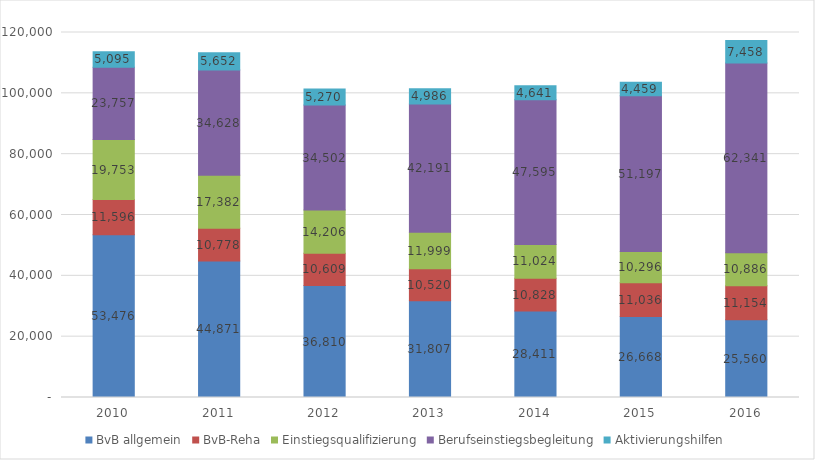
| Category | BvB allgemein | BvB-Reha | Einstiegsqualifizierung | Berufseinstiegsbegleitung | Aktivierungshilfen |
|---|---|---|---|---|---|
| 2010.0 | 53476.083 | 11596.25 | 19753.167 | 23756.833 | 5095 |
| 2011.0 | 44871 | 10777.667 | 17382 | 34627.833 | 5652 |
| 2012.0 | 36810.417 | 10608.667 | 14205.583 | 34501.5 | 5270.417 |
| 2013.0 | 31806.833 | 10520.333 | 11999.167 | 42191.167 | 4985.917 |
| 2014.0 | 28411.167 | 10827.667 | 11023.833 | 47595.083 | 4640.5 |
| 2015.0 | 26668 | 11036 | 10296 | 51197.167 | 4459 |
| 2016.0 | 25560.167 | 11154.333 | 10885.833 | 62341.167 | 7458 |